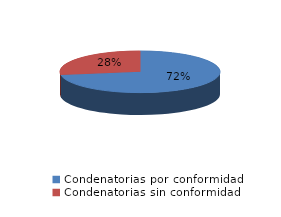
| Category | Series 0 |
|---|---|
| 0 | 1035 |
| 1 | 393 |